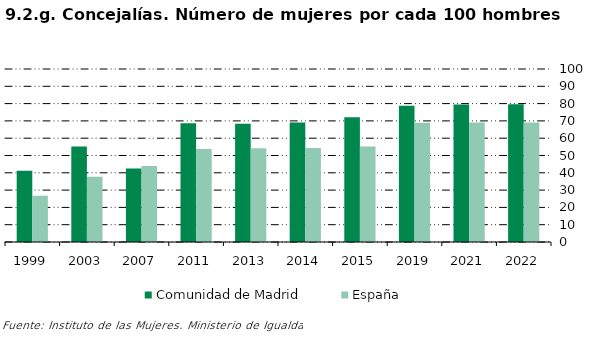
| Category | Comunidad de Madrid | España |
|---|---|---|
| 1999.0 | 41.141 | 26.74 |
| 2003.0 | 55.156 | 37.646 |
| 2007.0 | 42.538 | 43.885 |
| 2011.0 | 68.615 | 53.728 |
| 2013.0 | 68.353 | 54.243 |
| 2014.0 | 69.063 | 54.406 |
| 2015.0 | 72.039 | 55.202 |
| 2019.0 | 78.763 | 68.987 |
| 2021.0 | 79.427 | 69.068 |
| 2022.0 | 79.645 | 69.119 |